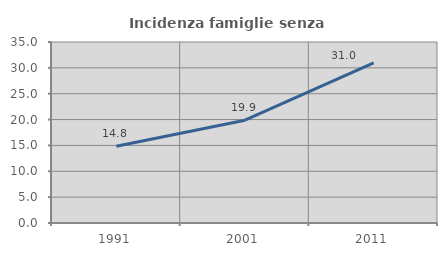
| Category | Incidenza famiglie senza nuclei |
|---|---|
| 1991.0 | 14.83 |
| 2001.0 | 19.884 |
| 2011.0 | 30.982 |